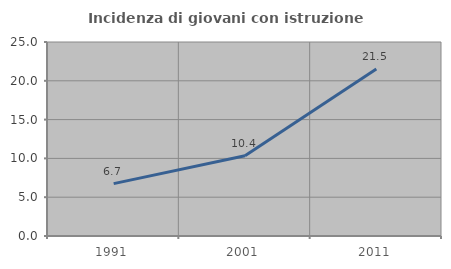
| Category | Incidenza di giovani con istruzione universitaria |
|---|---|
| 1991.0 | 6.747 |
| 2001.0 | 10.352 |
| 2011.0 | 21.525 |